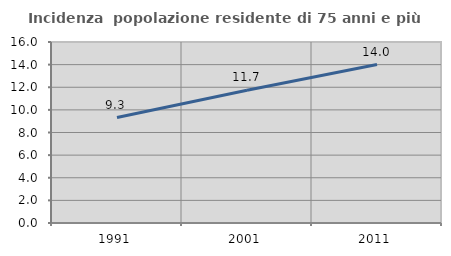
| Category | Incidenza  popolazione residente di 75 anni e più |
|---|---|
| 1991.0 | 9.323 |
| 2001.0 | 11.74 |
| 2011.0 | 14.004 |